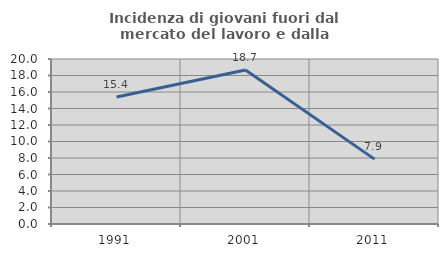
| Category | Incidenza di giovani fuori dal mercato del lavoro e dalla formazione  |
|---|---|
| 1991.0 | 15.385 |
| 2001.0 | 18.659 |
| 2011.0 | 7.865 |